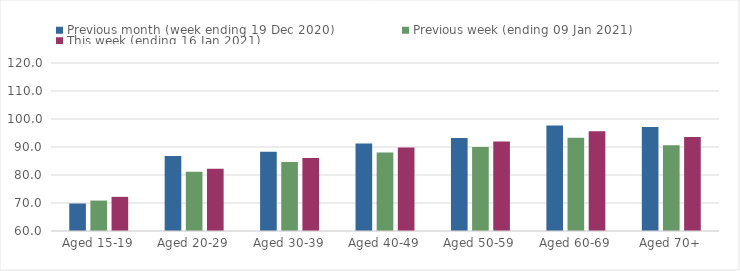
| Category | Previous month (week ending 19 Dec 2020) | Previous week (ending 09 Jan 2021) | This week (ending 16 Jan 2021) |
|---|---|---|---|
| Aged 15-19 | 69.82 | 70.87 | 72.2 |
| Aged 20-29 | 86.78 | 81.2 | 82.19 |
| Aged 30-39 | 88.31 | 84.66 | 86.07 |
| Aged 40-49 | 91.21 | 88.04 | 89.78 |
| Aged 50-59 | 93.19 | 90.02 | 91.97 |
| Aged 60-69 | 97.64 | 93.32 | 95.62 |
| Aged 70+ | 97.15 | 90.63 | 93.53 |